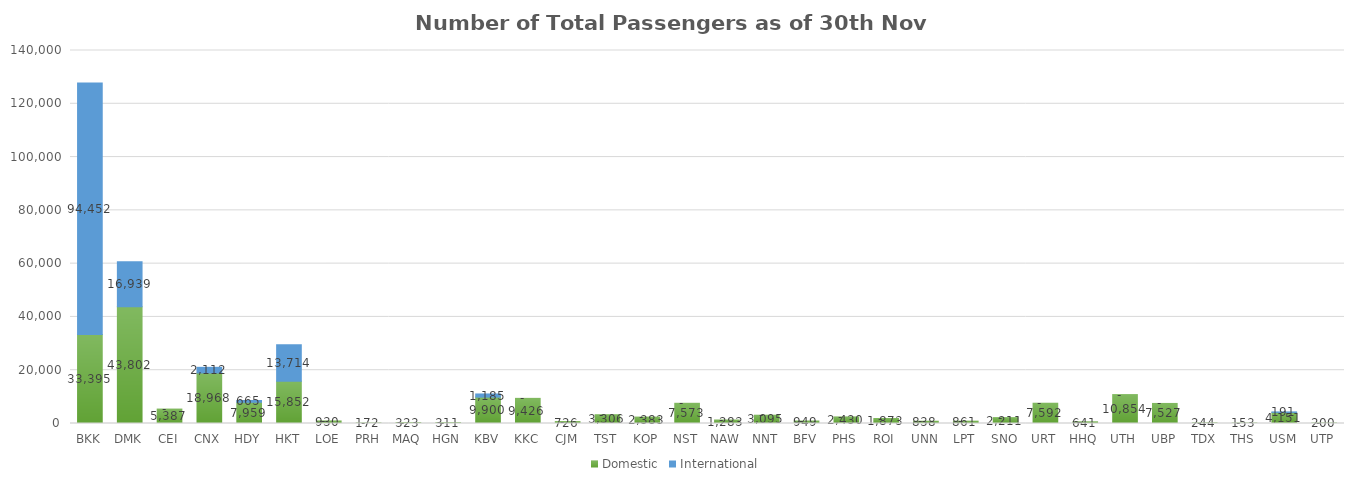
| Category | Domestic | International |
|---|---|---|
| BKK | 33395 | 94452 |
| DMK | 43802 | 16939 |
| CEI | 5387 | 0 |
| CNX | 18968 | 2112 |
| HDY | 7959 | 665 |
| HKT | 15852 | 13714 |
| LOE | 930 | 0 |
| PRH | 172 | 0 |
| MAQ | 323 | 0 |
| HGN | 311 | 0 |
| KBV | 9900 | 1185 |
| KKC | 9426 | 0 |
| CJM | 726 | 0 |
| TST | 3306 | 0 |
| KOP | 2383 | 0 |
| NST | 7573 | 0 |
| NAW | 1283 | 0 |
| NNT | 3095 | 0 |
| BFV | 949 | 0 |
| PHS | 2430 | 0 |
| ROI | 1873 | 0 |
| UNN | 838 | 0 |
| LPT | 861 | 0 |
| SNO | 2211 | 0 |
| URT | 7592 | 0 |
| HHQ | 641 | 0 |
| UTH | 10854 | 0 |
| UBP | 7527 | 0 |
| TDX | 244 | 0 |
| THS | 153 | 0 |
| USM | 4151 | 191 |
| UTP | 200 | 0 |